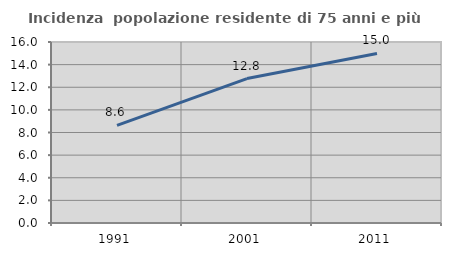
| Category | Incidenza  popolazione residente di 75 anni e più |
|---|---|
| 1991.0 | 8.625 |
| 2001.0 | 12.766 |
| 2011.0 | 14.984 |